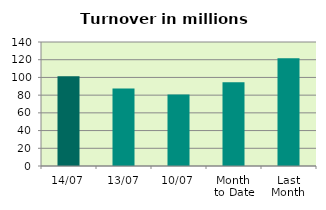
| Category | Series 0 |
|---|---|
| 14/07 | 101.314 |
| 13/07 | 87.415 |
| 10/07 | 80.819 |
| Month 
to Date | 94.423 |
| Last
Month | 121.74 |